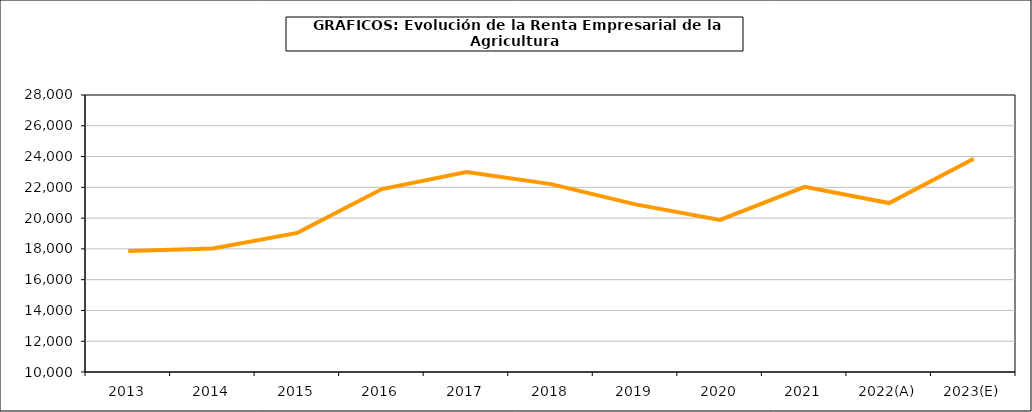
| Category | renta empresarial |
|---|---|
| 2013 | 17858.951 |
| 2014 | 18029.917 |
| 2015 | 19041.49 |
| 2016 | 21888.067 |
| 2017 | 23001.377 |
| 2018 | 22207.785 |
| 2019 | 20890.665 |
| 2020 | 19887.467 |
| 2021 | 22027.813 |
| 2022(A) | 20978.441 |
| 2023(E) | 23855.363 |